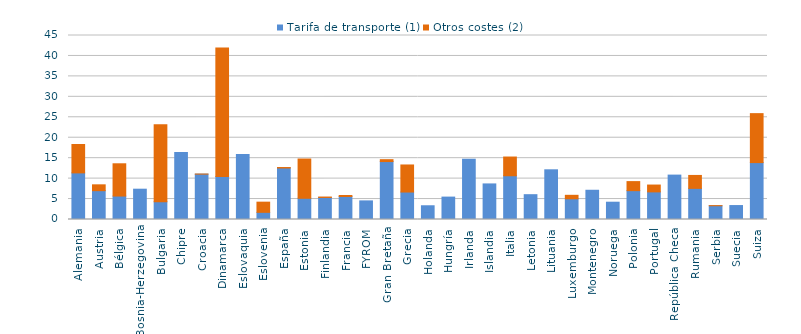
| Category | Tarifa de transporte (1) | Otros costes (2) |
|---|---|---|
| Alemania | 11.4 | 6.95 |
| Austria | 7.05 | 1.43 |
| Bélgica | 5.736 | 7.89 |
| Bosnia-Herzegovina | 7.412 | 0 |
| Bulgaria | 4.36 | 18.83 |
| Chipre | 16.4 | 0 |
| Croacia | 11.1 | 0.01 |
| Dinamarca | 10.51 | 31.43 |
| Eslovaquia | 15.867 | 0 |
| Eslovenia | 1.752 | 2.49 |
| España | 12.597 | 0.113 |
| Estonia | 5.19 | 9.6 |
| Finlandia | 5.39 | 0.1 |
| Francia | 5.632 | 0.231 |
| FYROM | 4.55 | 0 |
| Gran Bretaña | 14.17 | 0.46 |
| Grecia | 6.716 | 6.62 |
| Holanda | 3.36 | 0 |
| Hungría | 5.48 | 0 |
| Irlanda | 14.74 | 0 |
| Islandia | 8.7 | 0 |
| Italia | 10.7 | 4.58 |
| Letonia | 6.07 | 0 |
| Lituania | 12.155 | 0 |
| Luxemburgo | 5.066 | 0.85 |
| Montenegro | 7.15 | 0 |
| Noruega | 4.23 | 0 |
| Polonia | 7.054 | 2.213 |
| Portugal | 6.752 | 1.674 |
| República Checa | 10.86 | 0 |
| Rumania | 7.616 | 3.16 |
| Serbia | 3.367 | 0.024 |
| Suecia | 3.41 | 0 |
| Suiza | 13.92 | 11.97 |